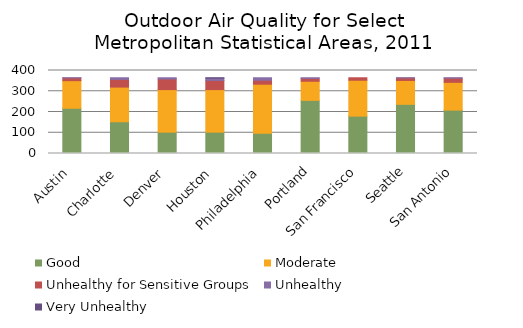
| Category | Good | Moderate | Unhealthy for Sensitive Groups | Unhealthy   | Very Unhealthy |
|---|---|---|---|---|---|
| Austin | 218 | 133 | 13 | 1 | 0 |
| Charlotte | 153 | 167 | 37 | 8 | 0 |
| Denver | 103 | 205 | 51 | 6 | 0 |
| Houston | 103 | 205 | 44 | 11 | 2 |
| Philadelphia | 98 | 236 | 19 | 12 | 0 |
| Portland | 256 | 92 | 14 | 3 | 0 |
| San Francisco | 180 | 173 | 12 | 0 | 0 |
| Seattle | 237 | 115 | 12 | 1 | 0 |
| San Antonio | 209 | 134 | 20 | 2 | 0 |